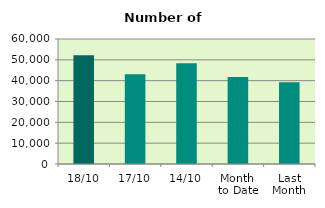
| Category | Series 0 |
|---|---|
| 18/10 | 52206 |
| 17/10 | 43038 |
| 14/10 | 48400 |
| Month 
to Date | 41815.333 |
| Last
Month | 39229.818 |